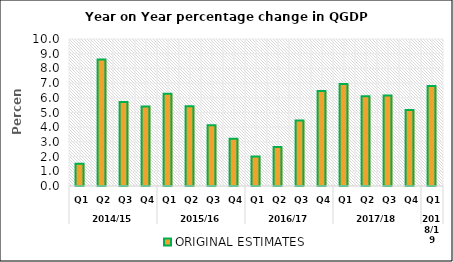
| Category | ORIGINAL ESTIMATES |
|---|---|
| 0 | 1.509 |
| 1 | 8.612 |
| 2 | 5.718 |
| 3 | 5.409 |
| 4 | 6.269 |
| 5 | 5.424 |
| 6 | 4.14 |
| 7 | 3.22 |
| 8 | 2.005 |
| 9 | 2.659 |
| 10 | 4.462 |
| 11 | 6.46 |
| 12 | 6.94 |
| 13 | 6.097 |
| 14 | 6.15 |
| 15 | 5.17 |
| 16 | 6.802 |